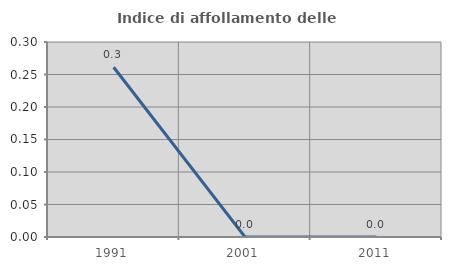
| Category | Indice di affollamento delle abitazioni  |
|---|---|
| 1991.0 | 0.261 |
| 2001.0 | 0 |
| 2011.0 | 0 |